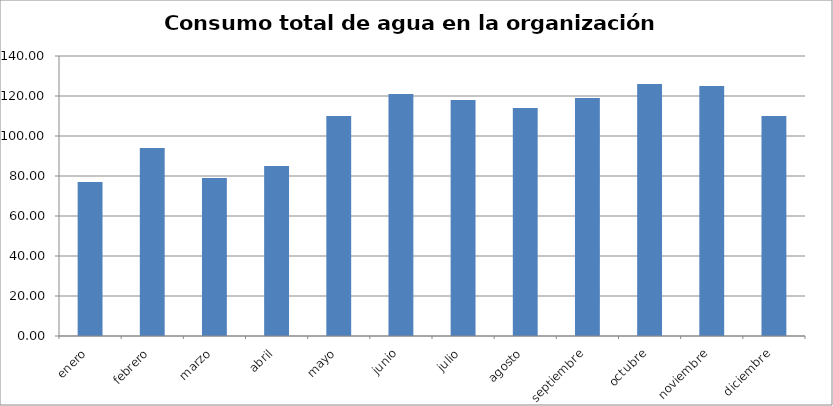
| Category | Series 0 |
|---|---|
| enero | 77 |
| febrero | 94 |
| marzo | 79 |
| abril | 85 |
| mayo | 110 |
| junio | 121 |
| julio | 118 |
| agosto | 114 |
| septiembre | 119 |
| octubre | 126 |
| noviembre | 125 |
| diciembre | 110 |